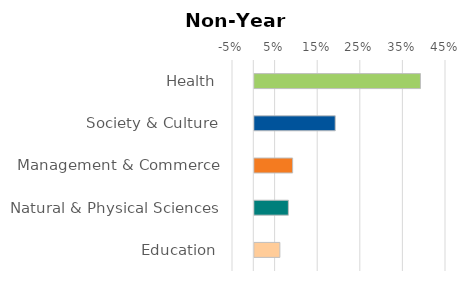
| Category | Series 0 |
|---|---|
| Health | 0.39 |
| Society & Culture | 0.19 |
| Management & Commerce | 0.09 |
| Natural & Physical Sciences | 0.08 |
| Education | 0.06 |